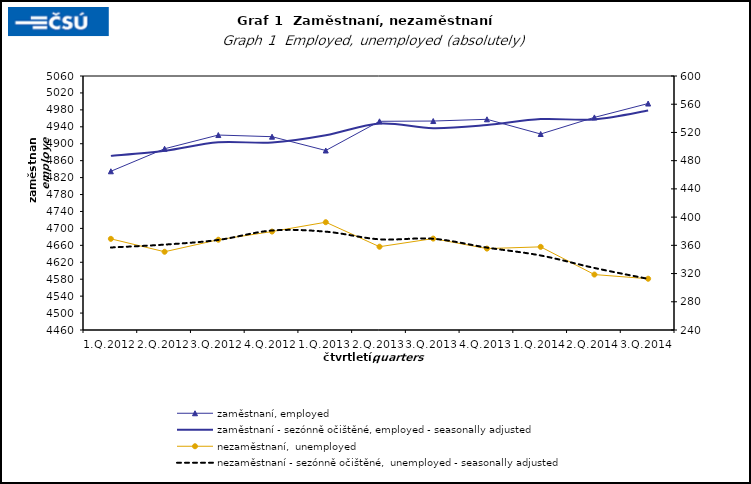
| Category | zaměstnaní, employed | zaměstnaní - sezónně očištěné, employed - seasonally adjusted |
|---|---|---|
| 1.Q.2012 | 4834.893 | 4871.328 |
| 2.Q.2012 | 4888.134 | 4883.532 |
| 3.Q.2012 | 4920.551 | 4903.484 |
| 4.Q.2012 | 4916.635 | 4902.714 |
| 1.Q.2013 | 4884.025 | 4919.832 |
| 2.Q.2013 | 4952.991 | 4947.695 |
| 3.Q.2013 | 4953.606 | 4936.798 |
| 4.Q.2013 | 4957.713 | 4944.231 |
| 1.Q.2014 | 4922.963 | 4958.176 |
| 2.Q.2014 | 4962.219 | 4957.43 |
| 3.Q.2014 | 4994.947 | 4978.258 |